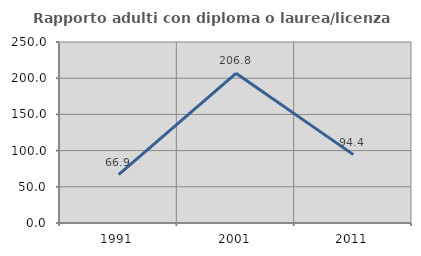
| Category | Rapporto adulti con diploma o laurea/licenza media  |
|---|---|
| 1991.0 | 66.86 |
| 2001.0 | 206.818 |
| 2011.0 | 94.444 |